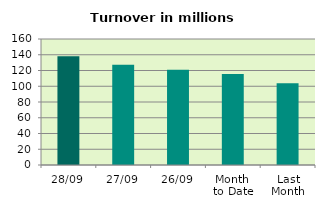
| Category | Series 0 |
|---|---|
| 28/09 | 138.177 |
| 27/09 | 127.296 |
| 26/09 | 121.005 |
| Month 
to Date | 115.41 |
| Last
Month | 103.765 |